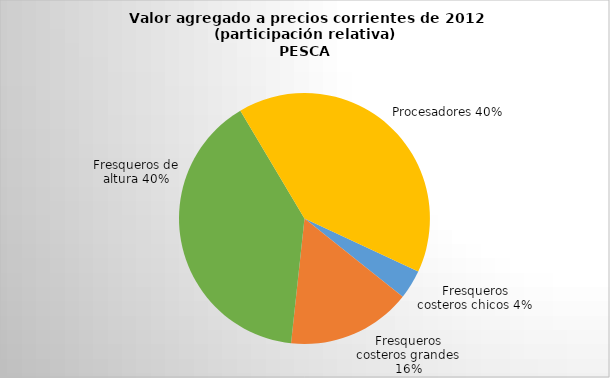
| Category | Series 0 |
|---|---|
| Fresqueros costeros chicos | 40.664 |
| Fresqueros costeros grandes | 173.573 |
| Fresqueros de altura | 430.86 |
| Procesadores | 438.802 |